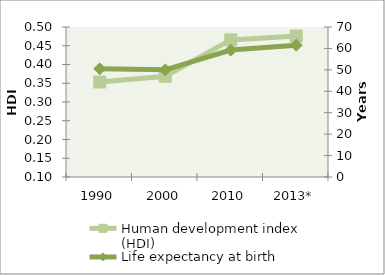
| Category | Human development index (HDI) |
|---|---|
| 1990 | 0.353 |
| 2000 | 0.369 |
| 2010 | 0.466 |
| 2013* | 0.476 |